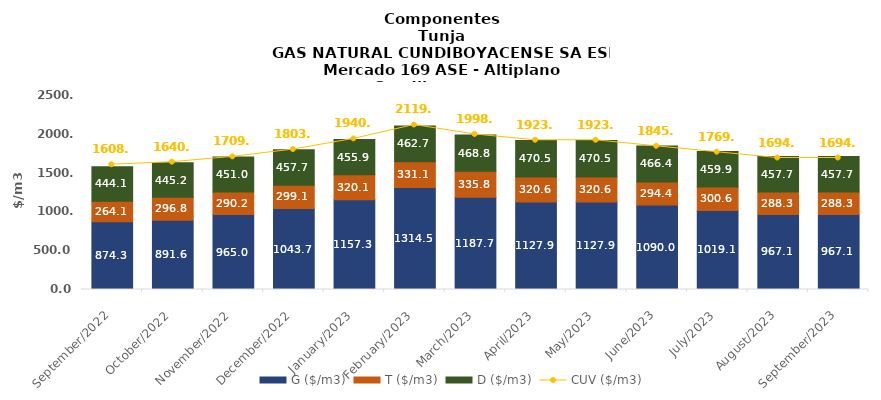
| Category | G ($/m3) | T ($/m3) | D ($/m3) |
|---|---|---|---|
| 2022-09-01 | 874.34 | 264.11 | 444.06 |
| 2022-10-01 | 891.55 | 296.77 | 445.21 |
| 2022-11-01 | 964.95 | 290.22 | 450.99 |
| 2022-12-01 | 1043.68 | 299.05 | 457.65 |
| 2023-01-01 | 1157.27 | 320.12 | 455.93 |
| 2023-02-01 | 1314.49 | 331.09 | 462.69 |
| 2023-03-01 | 1187.7 | 335.79 | 468.75 |
| 2023-04-01 | 1127.9 | 320.55 | 470.54 |
| 2023-05-01 | 1127.9 | 320.55 | 470.54 |
| 2023-06-01 | 1090.01 | 294.4 | 466.35 |
| 2023-07-01 | 1019.05 | 300.55 | 459.92 |
| 2023-08-01 | 967.08 | 288.3 | 457.73 |
| 2023-09-01 | 967.08 | 288.3 | 457.72 |